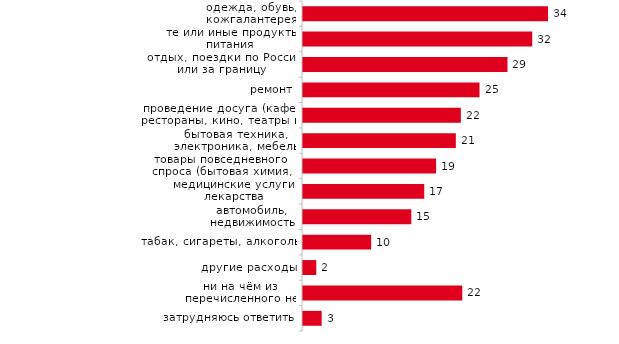
| Category | Series 0 |
|---|---|
| одежда, обувь, кожгалантерея | 34.15 |
| те или иные продукты питания | 31.95 |
| отдых, поездки по России или за границу | 28.5 |
| ремонт | 24.6 |
| проведение досуга (кафе, рестораны, кино, театры и т.п.) | 22 |
| бытовая техника, электроника, мебель | 21.3 |
| товары повседневного спроса (бытовая химия, парфюмерно-косметические товары и т.д.) | 18.55 |
| медицинские услуги, лекарства | 16.9 |
| автомобиль, недвижимость | 15.1 |
| табак, сигареты, алкоголь | 9.5 |
| другие расходы | 1.85 |
| ни на чём из перечисленного не экономили | 22.2 |
| затрудняюсь ответить | 2.6 |